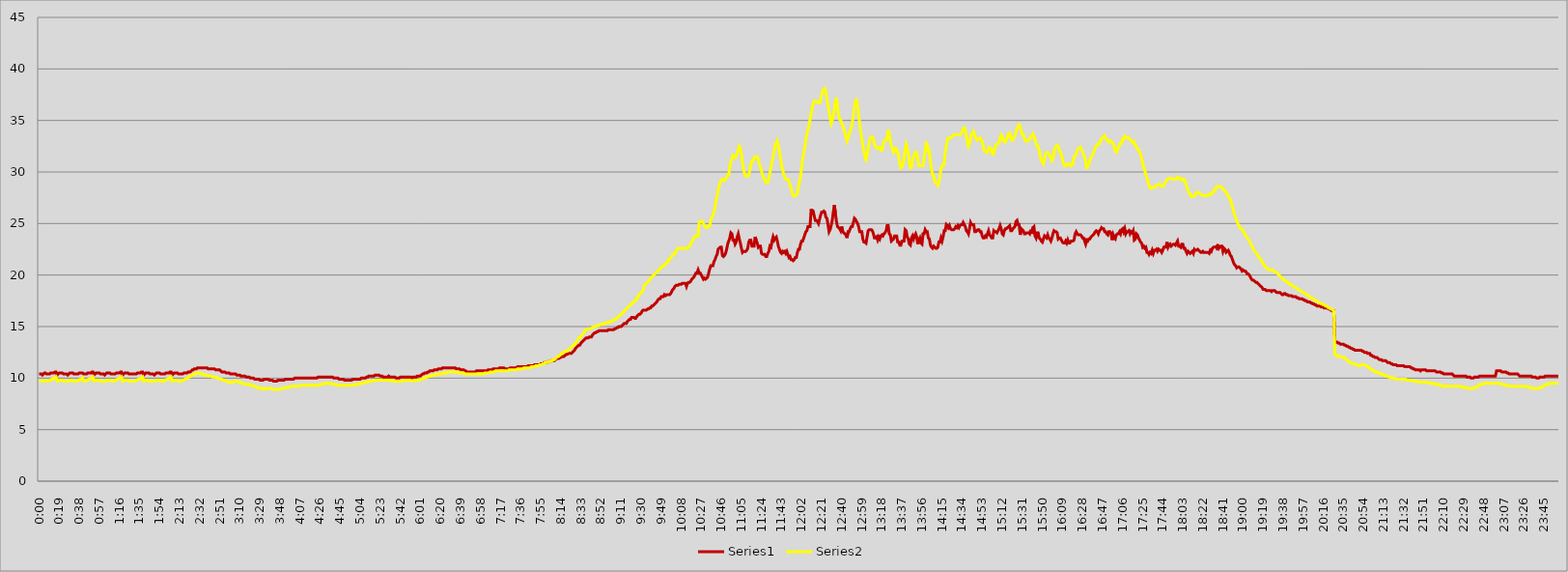
| Category | Series 0 | Series 1 |
|---|---|---|
| 0.0 | 10.4 | 9.7 |
| 0.0006944444444444445 | 10.4 | 9.7 |
| 0.00138888888888889 | 10.4 | 9.7 |
| 0.00208333333333333 | 10.3 | 9.7 |
| 0.00277777777777778 | 10.4 | 9.7 |
| 0.00347222222222222 | 10.5 | 9.8 |
| 0.00416666666666667 | 10.5 | 9.8 |
| 0.00486111111111111 | 10.4 | 9.7 |
| 0.00555555555555556 | 10.4 | 9.7 |
| 0.00625 | 10.4 | 9.7 |
| 0.00694444444444444 | 10.4 | 9.8 |
| 0.00763888888888889 | 10.5 | 9.8 |
| 0.00833333333333333 | 10.5 | 9.9 |
| 0.00902777777777778 | 10.5 | 9.9 |
| 0.00972222222222222 | 10.5 | 10 |
| 0.0104166666666667 | 10.6 | 10 |
| 0.0111111111111111 | 10.6 | 10.1 |
| 0.0118055555555556 | 10.3 | 9.7 |
| 0.0125 | 10.4 | 9.7 |
| 0.0131944444444444 | 10.5 | 9.8 |
| 0.0138888888888889 | 10.5 | 9.8 |
| 0.0145833333333333 | 10.5 | 9.8 |
| 0.0152777777777778 | 10.5 | 9.8 |
| 0.0159722222222222 | 10.4 | 9.7 |
| 0.0166666666666667 | 10.4 | 9.7 |
| 0.0173611111111111 | 10.4 | 9.7 |
| 0.0180555555555556 | 10.4 | 9.7 |
| 0.01875 | 10.3 | 9.7 |
| 0.0194444444444444 | 10.4 | 9.7 |
| 0.0201388888888889 | 10.5 | 9.8 |
| 0.0208333333333333 | 10.5 | 9.8 |
| 0.0215277777777778 | 10.5 | 9.8 |
| 0.0222222222222222 | 10.5 | 9.8 |
| 0.0229166666666667 | 10.4 | 9.7 |
| 0.0236111111111111 | 10.4 | 9.7 |
| 0.0243055555555556 | 10.4 | 9.7 |
| 0.025 | 10.4 | 9.7 |
| 0.0256944444444444 | 10.4 | 9.8 |
| 0.0263888888888889 | 10.5 | 9.8 |
| 0.0270833333333333 | 10.5 | 9.9 |
| 0.0277777777777778 | 10.5 | 9.9 |
| 0.0284722222222222 | 10.5 | 10 |
| 0.0291666666666667 | 10.4 | 9.7 |
| 0.0298611111111111 | 10.4 | 9.7 |
| 0.0305555555555556 | 10.4 | 9.7 |
| 0.03125 | 10.4 | 9.8 |
| 0.0319444444444444 | 10.5 | 9.8 |
| 0.0326388888888889 | 10.5 | 9.9 |
| 0.0333333333333333 | 10.5 | 9.9 |
| 0.0340277777777778 | 10.5 | 10 |
| 0.0347222222222222 | 10.6 | 10 |
| 0.0354166666666667 | 10.6 | 10.1 |
| 0.0361111111111111 | 10.3 | 9.7 |
| 0.0368055555555556 | 10.4 | 9.7 |
| 0.0375 | 10.5 | 9.8 |
| 0.0381944444444444 | 10.5 | 9.8 |
| 0.0388888888888889 | 10.5 | 9.8 |
| 0.0395833333333333 | 10.5 | 9.8 |
| 0.0402777777777778 | 10.4 | 9.7 |
| 0.0409722222222222 | 10.4 | 9.7 |
| 0.0416666666666667 | 10.4 | 9.7 |
| 0.0423611111111111 | 10.4 | 9.7 |
| 0.0430555555555556 | 10.3 | 9.7 |
| 0.04375 | 10.4 | 9.7 |
| 0.0444444444444444 | 10.5 | 9.8 |
| 0.0451388888888889 | 10.5 | 9.8 |
| 0.0458333333333333 | 10.5 | 9.8 |
| 0.0465277777777778 | 10.5 | 9.8 |
| 0.0472222222222222 | 10.4 | 9.7 |
| 0.0479166666666667 | 10.4 | 9.7 |
| 0.0486111111111111 | 10.4 | 9.7 |
| 0.0493055555555556 | 10.4 | 9.7 |
| 0.05 | 10.4 | 9.8 |
| 0.0506944444444444 | 10.5 | 9.8 |
| 0.0513888888888889 | 10.5 | 9.9 |
| 0.0520833333333333 | 10.5 | 9.9 |
| 0.0527777777777778 | 10.5 | 10 |
| 0.0534722222222222 | 10.6 | 10 |
| 0.0541666666666667 | 10.6 | 10.1 |
| 0.0548611111111111 | 10.3 | 9.7 |
| 0.0555555555555556 | 10.4 | 9.7 |
| 0.05625 | 10.5 | 9.8 |
| 0.0569444444444444 | 10.5 | 9.8 |
| 0.0576388888888889 | 10.5 | 9.8 |
| 0.0583333333333333 | 10.5 | 9.8 |
| 0.0590277777777778 | 10.4 | 9.7 |
| 0.0597222222222222 | 10.4 | 9.7 |
| 0.0604166666666667 | 10.4 | 9.7 |
| 0.0611111111111111 | 10.4 | 9.7 |
| 0.0618055555555556 | 10.4 | 9.7 |
| 0.0625 | 10.4 | 9.7 |
| 0.0631944444444444 | 10.4 | 9.7 |
| 0.0638888888888889 | 10.4 | 9.8 |
| 0.0645833333333333 | 10.5 | 9.8 |
| 0.0652777777777778 | 10.5 | 9.9 |
| 0.0659722222222222 | 10.5 | 9.9 |
| 0.0666666666666667 | 10.5 | 10 |
| 0.0673611111111111 | 10.6 | 10 |
| 0.0680555555555556 | 10.6 | 10.1 |
| 0.06875 | 10.3 | 9.7 |
| 0.0694444444444444 | 10.4 | 9.7 |
| 0.0701388888888889 | 10.5 | 9.8 |
| 0.0708333333333333 | 10.5 | 9.8 |
| 0.0715277777777778 | 10.5 | 9.8 |
| 0.0722222222222222 | 10.5 | 9.8 |
| 0.0729166666666667 | 10.4 | 9.7 |
| 0.0736111111111111 | 10.4 | 9.7 |
| 0.0743055555555556 | 10.4 | 9.7 |
| 0.075 | 10.4 | 9.7 |
| 0.0756944444444445 | 10.3 | 9.7 |
| 0.0763888888888889 | 10.4 | 9.7 |
| 0.0770833333333333 | 10.5 | 9.8 |
| 0.0777777777777778 | 10.5 | 9.8 |
| 0.0784722222222222 | 10.5 | 9.8 |
| 0.0791666666666667 | 10.5 | 9.8 |
| 0.0798611111111111 | 10.4 | 9.7 |
| 0.0805555555555556 | 10.4 | 9.7 |
| 0.08125 | 10.4 | 9.7 |
| 0.0819444444444444 | 10.4 | 9.7 |
| 0.0826388888888889 | 10.4 | 9.8 |
| 0.0833333333333333 | 10.5 | 9.8 |
| 0.0840277777777778 | 10.5 | 9.9 |
| 0.0847222222222222 | 10.5 | 9.9 |
| 0.0854166666666667 | 10.5 | 10 |
| 0.0861111111111111 | 10.6 | 10 |
| 0.0868055555555556 | 10.6 | 10.1 |
| 0.0875 | 10.3 | 9.7 |
| 0.0881944444444445 | 10.4 | 9.7 |
| 0.0888888888888889 | 10.5 | 9.8 |
| 0.0895833333333333 | 10.5 | 9.8 |
| 0.0902777777777778 | 10.5 | 9.8 |
| 0.0909722222222222 | 10.5 | 9.8 |
| 0.0916666666666667 | 10.4 | 9.7 |
| 0.0923611111111111 | 10.4 | 9.7 |
| 0.0930555555555556 | 10.4 | 9.7 |
| 0.09375 | 10.4 | 9.7 |
| 0.0944444444444444 | 10.4 | 9.8 |
| 0.0951388888888889 | 10.5 | 9.8 |
| 0.0958333333333333 | 10.5 | 9.9 |
| 0.0965277777777778 | 10.5 | 9.9 |
| 0.0972222222222222 | 10.5 | 10 |
| 0.0979166666666667 | 10.6 | 10 |
| 0.0986111111111111 | 10.6 | 10.1 |
| 0.0993055555555556 | 10.6 | 10.2 |
| 0.1 | 10.7 | 10.2 |
| 0.100694444444444 | 10.8 | 10.3 |
| 0.101388888888889 | 10.8 | 10.4 |
| 0.102083333333333 | 10.9 | 10.4 |
| 0.102777777777778 | 10.9 | 10.4 |
| 0.103472222222222 | 10.9 | 10.5 |
| 0.104166666666667 | 11 | 10.5 |
| 0.104861111111111 | 11 | 10.5 |
| 0.105555555555556 | 11 | 10.5 |
| 0.10625 | 11 | 10.4 |
| 0.106944444444444 | 11 | 10.4 |
| 0.107638888888889 | 11 | 10.4 |
| 0.108333333333333 | 11 | 10.3 |
| 0.109027777777778 | 11 | 10.3 |
| 0.109722222222222 | 11 | 10.3 |
| 0.110416666666667 | 11 | 10.3 |
| 0.111111111111111 | 10.9 | 10.2 |
| 0.111805555555556 | 10.9 | 10.2 |
| 0.1125 | 10.9 | 10.2 |
| 0.113194444444444 | 10.9 | 10.2 |
| 0.113888888888889 | 10.9 | 10.1 |
| 0.114583333333333 | 10.9 | 10.1 |
| 0.115277777777778 | 10.9 | 10.1 |
| 0.115972222222222 | 10.8 | 10.1 |
| 0.116666666666667 | 10.8 | 10 |
| 0.117361111111111 | 10.8 | 10 |
| 0.118055555555556 | 10.8 | 10 |
| 0.11875 | 10.8 | 9.9 |
| 0.119444444444444 | 10.7 | 9.9 |
| 0.120138888888889 | 10.6 | 9.9 |
| 0.120833333333333 | 10.6 | 9.8 |
| 0.121527777777778 | 10.6 | 9.8 |
| 0.122222222222222 | 10.6 | 9.8 |
| 0.122916666666667 | 10.5 | 9.7 |
| 0.123611111111111 | 10.5 | 9.7 |
| 0.124305555555556 | 10.5 | 9.6 |
| 0.125 | 10.5 | 9.6 |
| 0.125694444444444 | 10.4 | 9.6 |
| 0.126388888888889 | 10.4 | 9.6 |
| 0.127083333333333 | 10.4 | 9.6 |
| 0.127777777777778 | 10.4 | 9.6 |
| 0.128472222222222 | 10.4 | 9.7 |
| 0.129166666666667 | 10.4 | 9.7 |
| 0.129861111111111 | 10.3 | 9.7 |
| 0.130555555555556 | 10.3 | 9.7 |
| 0.13125 | 10.3 | 9.6 |
| 0.131944444444444 | 10.3 | 9.6 |
| 0.132638888888889 | 10.2 | 9.6 |
| 0.133333333333333 | 10.2 | 9.5 |
| 0.134027777777778 | 10.2 | 9.5 |
| 0.134722222222222 | 10.2 | 9.4 |
| 0.135416666666667 | 10.2 | 9.4 |
| 0.136111111111111 | 10.1 | 9.4 |
| 0.136805555555556 | 10.1 | 9.4 |
| 0.1375 | 10.1 | 9.4 |
| 0.138194444444444 | 10.1 | 9.4 |
| 0.138888888888889 | 10 | 9.3 |
| 0.139583333333333 | 10 | 9.3 |
| 0.140277777777778 | 10 | 9.3 |
| 0.140972222222222 | 10 | 9.2 |
| 0.141666666666667 | 9.9 | 9.2 |
| 0.142361111111111 | 9.9 | 9.2 |
| 0.143055555555556 | 9.9 | 9.1 |
| 0.14375 | 9.9 | 9.1 |
| 0.144444444444444 | 9.9 | 9 |
| 0.145138888888889 | 9.8 | 9 |
| 0.145833333333333 | 9.8 | 9 |
| 0.146527777777778 | 9.8 | 9 |
| 0.147222222222222 | 9.8 | 9 |
| 0.147916666666667 | 9.9 | 8.9 |
| 0.148611111111111 | 9.9 | 9 |
| 0.149305555555556 | 9.9 | 9 |
| 0.15 | 9.9 | 9 |
| 0.150694444444444 | 9.9 | 9 |
| 0.151388888888889 | 9.8 | 9 |
| 0.152083333333333 | 9.8 | 9 |
| 0.152777777777778 | 9.8 | 9 |
| 0.153472222222222 | 9.8 | 8.9 |
| 0.154166666666667 | 9.7 | 8.9 |
| 0.154861111111111 | 9.7 | 8.9 |
| 0.155555555555556 | 9.7 | 8.9 |
| 0.15625 | 9.7 | 8.9 |
| 0.156944444444444 | 9.8 | 8.9 |
| 0.157638888888889 | 9.8 | 8.9 |
| 0.158333333333333 | 9.8 | 8.9 |
| 0.159027777777778 | 9.8 | 9 |
| 0.159722222222222 | 9.8 | 9 |
| 0.160416666666667 | 9.8 | 9 |
| 0.161111111111111 | 9.8 | 9 |
| 0.161805555555556 | 9.9 | 9.1 |
| 0.1625 | 9.9 | 9.1 |
| 0.163194444444444 | 9.9 | 9.1 |
| 0.163888888888889 | 9.9 | 9.1 |
| 0.164583333333333 | 9.9 | 9.1 |
| 0.165277777777778 | 9.9 | 9.2 |
| 0.165972222222222 | 9.9 | 9.2 |
| 0.166666666666667 | 9.9 | 9.2 |
| 0.167361111111111 | 9.9 | 9.2 |
| 0.168055555555556 | 10 | 9.2 |
| 0.16875 | 10 | 9.2 |
| 0.169444444444444 | 10 | 9.2 |
| 0.170138888888889 | 10 | 9.2 |
| 0.170833333333333 | 10 | 9.2 |
| 0.171527777777778 | 10 | 9.3 |
| 0.172222222222222 | 10 | 9.3 |
| 0.172916666666667 | 10 | 9.3 |
| 0.173611111111111 | 10 | 9.3 |
| 0.174305555555556 | 10 | 9.3 |
| 0.175 | 10 | 9.3 |
| 0.175694444444444 | 10 | 9.3 |
| 0.176388888888889 | 10 | 9.3 |
| 0.177083333333333 | 10 | 9.3 |
| 0.177777777777778 | 10 | 9.3 |
| 0.178472222222222 | 10 | 9.3 |
| 0.179166666666667 | 10 | 9.3 |
| 0.179861111111111 | 10 | 9.3 |
| 0.180555555555556 | 10 | 9.3 |
| 0.18125 | 10 | 9.3 |
| 0.181944444444444 | 10 | 9.3 |
| 0.182638888888889 | 10 | 9.3 |
| 0.183333333333333 | 10.1 | 9.3 |
| 0.184027777777778 | 10.1 | 9.3 |
| 0.184722222222222 | 10.1 | 9.4 |
| 0.185416666666667 | 10.1 | 9.4 |
| 0.186111111111111 | 10.1 | 9.4 |
| 0.186805555555556 | 10.1 | 9.4 |
| 0.1875 | 10.1 | 9.5 |
| 0.188194444444444 | 10.1 | 9.5 |
| 0.188888888888889 | 10.1 | 9.5 |
| 0.189583333333333 | 10.1 | 9.5 |
| 0.190277777777778 | 10.1 | 9.5 |
| 0.190972222222222 | 10.1 | 9.5 |
| 0.191666666666667 | 10.1 | 9.5 |
| 0.192361111111111 | 10.1 | 9.4 |
| 0.193055555555556 | 10.1 | 9.4 |
| 0.19375 | 10 | 9.4 |
| 0.194444444444444 | 10 | 9.4 |
| 0.195138888888889 | 10 | 9.4 |
| 0.195833333333333 | 10 | 9.3 |
| 0.196527777777778 | 10 | 9.3 |
| 0.197222222222222 | 9.9 | 9.3 |
| 0.197916666666667 | 9.9 | 9.3 |
| 0.198611111111111 | 9.9 | 9.3 |
| 0.199305555555556 | 9.9 | 9.3 |
| 0.2 | 9.9 | 9.3 |
| 0.200694444444444 | 9.8 | 9.3 |
| 0.201388888888889 | 9.8 | 9.3 |
| 0.202083333333333 | 9.8 | 9.3 |
| 0.202777777777778 | 9.8 | 9.3 |
| 0.203472222222222 | 9.8 | 9.3 |
| 0.204166666666667 | 9.8 | 9.3 |
| 0.204861111111111 | 9.8 | 9.3 |
| 0.205555555555556 | 9.8 | 9.3 |
| 0.20625 | 9.9 | 9.3 |
| 0.206944444444444 | 9.9 | 9.3 |
| 0.207638888888889 | 9.9 | 9.4 |
| 0.208333333333333 | 9.9 | 9.4 |
| 0.209027777777778 | 9.9 | 9.4 |
| 0.209722222222222 | 9.9 | 9.4 |
| 0.210416666666667 | 9.9 | 9.4 |
| 0.211111111111111 | 9.9 | 9.5 |
| 0.211805555555556 | 10 | 9.5 |
| 0.2125 | 10 | 9.5 |
| 0.213194444444444 | 10 | 9.5 |
| 0.213888888888889 | 10 | 9.6 |
| 0.214583333333333 | 10 | 9.6 |
| 0.215277777777778 | 10.1 | 9.6 |
| 0.215972222222222 | 10.1 | 9.6 |
| 0.216666666666667 | 10.2 | 9.7 |
| 0.217361111111111 | 10.2 | 9.7 |
| 0.218055555555556 | 10.2 | 9.7 |
| 0.21875 | 10.2 | 9.7 |
| 0.219444444444444 | 10.2 | 9.7 |
| 0.220138888888889 | 10.2 | 9.8 |
| 0.220833333333333 | 10.3 | 9.8 |
| 0.221527777777778 | 10.3 | 9.8 |
| 0.222222222222222 | 10.3 | 9.8 |
| 0.222916666666667 | 10.3 | 9.8 |
| 0.223611111111111 | 10.3 | 9.8 |
| 0.224305555555556 | 10.2 | 9.8 |
| 0.225 | 10.2 | 9.8 |
| 0.225694444444444 | 10.2 | 9.8 |
| 0.226388888888889 | 10.1 | 9.8 |
| 0.227083333333333 | 10.1 | 9.8 |
| 0.227777777777778 | 10.1 | 9.8 |
| 0.228472222222222 | 10.1 | 9.8 |
| 0.229166666666667 | 10.1 | 9.8 |
| 0.229861111111111 | 10.2 | 9.8 |
| 0.230555555555556 | 10.1 | 9.8 |
| 0.23125 | 10.1 | 9.7 |
| 0.231944444444444 | 10.1 | 9.7 |
| 0.232638888888889 | 10.1 | 9.7 |
| 0.233333333333333 | 10.1 | 9.7 |
| 0.234027777777778 | 10.1 | 9.7 |
| 0.234722222222222 | 10 | 9.7 |
| 0.235416666666667 | 10 | 9.7 |
| 0.236111111111111 | 10 | 9.7 |
| 0.236805555555556 | 10 | 9.7 |
| 0.2375 | 10.1 | 9.7 |
| 0.238194444444444 | 10.1 | 9.7 |
| 0.238888888888889 | 10.1 | 9.7 |
| 0.239583333333333 | 10.1 | 9.7 |
| 0.240277777777778 | 10.1 | 9.8 |
| 0.240972222222222 | 10.1 | 9.8 |
| 0.241666666666667 | 10.1 | 9.8 |
| 0.242361111111111 | 10.1 | 9.8 |
| 0.243055555555556 | 10.1 | 9.8 |
| 0.24375 | 10.1 | 9.8 |
| 0.244444444444444 | 10.1 | 9.8 |
| 0.245138888888889 | 10 | 9.7 |
| 0.245833333333333 | 10.1 | 9.7 |
| 0.246527777777778 | 10.1 | 9.8 |
| 0.247222222222222 | 10.1 | 9.8 |
| 0.247916666666667 | 10.1 | 9.8 |
| 0.248611111111111 | 10.2 | 9.8 |
| 0.249305555555556 | 10.2 | 9.8 |
| 0.25 | 10.2 | 9.8 |
| 0.250694444444444 | 10.2 | 9.9 |
| 0.251388888888889 | 10.3 | 9.9 |
| 0.252083333333333 | 10.4 | 9.9 |
| 0.252777777777778 | 10.4 | 10 |
| 0.253472222222222 | 10.5 | 10 |
| 0.254166666666667 | 10.5 | 10.1 |
| 0.254861111111111 | 10.5 | 10.1 |
| 0.255555555555556 | 10.6 | 10.1 |
| 0.25625 | 10.6 | 10.2 |
| 0.256944444444444 | 10.7 | 10.2 |
| 0.257638888888889 | 10.7 | 10.2 |
| 0.258333333333333 | 10.7 | 10.3 |
| 0.259027777777778 | 10.7 | 10.3 |
| 0.259722222222222 | 10.8 | 10.3 |
| 0.260416666666667 | 10.8 | 10.3 |
| 0.261111111111111 | 10.8 | 10.4 |
| 0.261805555555556 | 10.8 | 10.4 |
| 0.2625 | 10.9 | 10.4 |
| 0.263194444444444 | 10.9 | 10.4 |
| 0.263888888888889 | 10.9 | 10.4 |
| 0.264583333333333 | 10.9 | 10.4 |
| 0.265277777777778 | 11 | 10.5 |
| 0.265972222222222 | 11 | 10.5 |
| 0.266666666666667 | 11 | 10.5 |
| 0.267361111111111 | 11 | 10.5 |
| 0.268055555555556 | 11 | 10.5 |
| 0.26875 | 11 | 10.6 |
| 0.269444444444444 | 11 | 10.6 |
| 0.270138888888889 | 11 | 10.6 |
| 0.270833333333333 | 11 | 10.6 |
| 0.271527777777778 | 11 | 10.6 |
| 0.272222222222222 | 11 | 10.6 |
| 0.272916666666667 | 11 | 10.6 |
| 0.273611111111111 | 11 | 10.6 |
| 0.274305555555556 | 10.9 | 10.6 |
| 0.275 | 10.9 | 10.6 |
| 0.275694444444444 | 10.9 | 10.6 |
| 0.276388888888889 | 10.9 | 10.5 |
| 0.277083333333333 | 10.8 | 10.5 |
| 0.277777777777778 | 10.8 | 10.5 |
| 0.278472222222222 | 10.8 | 10.5 |
| 0.279166666666667 | 10.8 | 10.5 |
| 0.279861111111111 | 10.7 | 10.4 |
| 0.280555555555556 | 10.7 | 10.4 |
| 0.28125 | 10.6 | 10.4 |
| 0.281944444444444 | 10.6 | 10.4 |
| 0.282638888888889 | 10.6 | 10.4 |
| 0.283333333333333 | 10.6 | 10.4 |
| 0.284027777777778 | 10.6 | 10.4 |
| 0.284722222222222 | 10.6 | 10.4 |
| 0.285416666666667 | 10.6 | 10.4 |
| 0.286111111111111 | 10.6 | 10.4 |
| 0.286805555555556 | 10.6 | 10.4 |
| 0.2875 | 10.7 | 10.4 |
| 0.288194444444444 | 10.7 | 10.4 |
| 0.288888888888889 | 10.7 | 10.4 |
| 0.289583333333333 | 10.7 | 10.4 |
| 0.290277777777778 | 10.7 | 10.4 |
| 0.290972222222222 | 10.7 | 10.4 |
| 0.291666666666667 | 10.7 | 10.4 |
| 0.292361111111111 | 10.7 | 10.4 |
| 0.293055555555556 | 10.7 | 10.5 |
| 0.29375 | 10.7 | 10.5 |
| 0.294444444444444 | 10.7 | 10.5 |
| 0.295138888888889 | 10.8 | 10.5 |
| 0.295833333333333 | 10.8 | 10.5 |
| 0.296527777777778 | 10.8 | 10.6 |
| 0.297222222222222 | 10.8 | 10.6 |
| 0.297916666666667 | 10.8 | 10.6 |
| 0.298611111111111 | 10.9 | 10.6 |
| 0.299305555555556 | 10.9 | 10.6 |
| 0.3 | 10.9 | 10.7 |
| 0.300694444444444 | 10.9 | 10.7 |
| 0.301388888888889 | 10.9 | 10.7 |
| 0.302083333333333 | 10.9 | 10.7 |
| 0.302777777777778 | 11 | 10.7 |
| 0.303472222222222 | 11 | 10.7 |
| 0.304166666666667 | 11 | 10.7 |
| 0.304861111111111 | 11 | 10.7 |
| 0.305555555555556 | 11 | 10.7 |
| 0.30625 | 10.9 | 10.7 |
| 0.306944444444444 | 10.9 | 10.7 |
| 0.307638888888889 | 10.9 | 10.7 |
| 0.308333333333333 | 10.9 | 10.7 |
| 0.309027777777778 | 10.9 | 10.8 |
| 0.309722222222222 | 11 | 10.8 |
| 0.310416666666667 | 11 | 10.8 |
| 0.311111111111111 | 11 | 10.8 |
| 0.311805555555556 | 11 | 10.8 |
| 0.3125 | 11 | 10.8 |
| 0.313194444444444 | 11 | 10.8 |
| 0.313888888888889 | 11 | 10.8 |
| 0.314583333333333 | 11.1 | 10.9 |
| 0.315277777777778 | 11.1 | 10.9 |
| 0.315972222222222 | 11.1 | 10.9 |
| 0.316666666666667 | 11.1 | 10.9 |
| 0.317361111111111 | 11.1 | 10.9 |
| 0.318055555555556 | 11.1 | 10.9 |
| 0.31875 | 11.1 | 11 |
| 0.319444444444444 | 11.1 | 11 |
| 0.320138888888889 | 11.1 | 11 |
| 0.320833333333333 | 11.1 | 11 |
| 0.321527777777778 | 11.2 | 11 |
| 0.322222222222222 | 11.2 | 11 |
| 0.322916666666667 | 11.2 | 11 |
| 0.323611111111111 | 11.2 | 11.1 |
| 0.324305555555556 | 11.2 | 11.1 |
| 0.325 | 11.2 | 11.1 |
| 0.325694444444444 | 11.3 | 11.1 |
| 0.326388888888889 | 11.3 | 11.2 |
| 0.327083333333333 | 11.3 | 11.2 |
| 0.327777777777778 | 11.3 | 11.2 |
| 0.328472222222222 | 11.3 | 11.2 |
| 0.329166666666667 | 11.3 | 11.3 |
| 0.329861111111111 | 11.4 | 11.3 |
| 0.330555555555556 | 11.4 | 11.3 |
| 0.33125 | 11.4 | 11.4 |
| 0.331944444444444 | 11.5 | 11.4 |
| 0.332638888888889 | 11.5 | 11.5 |
| 0.333333333333333 | 11.5 | 11.5 |
| 0.334027777777778 | 11.5 | 11.5 |
| 0.334722222222222 | 11.6 | 11.6 |
| 0.335416666666667 | 11.6 | 11.6 |
| 0.336111111111111 | 11.6 | 11.6 |
| 0.336805555555556 | 11.7 | 11.7 |
| 0.3375 | 11.7 | 11.7 |
| 0.338194444444444 | 11.7 | 11.8 |
| 0.338888888888889 | 11.7 | 11.8 |
| 0.339583333333333 | 11.8 | 11.9 |
| 0.340277777777778 | 11.9 | 12 |
| 0.340972222222222 | 11.9 | 12.1 |
| 0.341666666666667 | 11.9 | 12.1 |
| 0.342361111111111 | 12 | 12.2 |
| 0.343055555555556 | 12 | 12.3 |
| 0.34375 | 12.1 | 12.4 |
| 0.344444444444444 | 12.1 | 12.5 |
| 0.345138888888889 | 12.1 | 12.5 |
| 0.345833333333333 | 12.2 | 12.6 |
| 0.346527777777778 | 12.3 | 12.6 |
| 0.347222222222222 | 12.3 | 12.6 |
| 0.347916666666667 | 12.4 | 12.7 |
| 0.348611111111111 | 12.4 | 12.8 |
| 0.349305555555556 | 12.4 | 12.9 |
| 0.35 | 12.4 | 13 |
| 0.350694444444444 | 12.5 | 13.1 |
| 0.351388888888889 | 12.6 | 13.2 |
| 0.352083333333333 | 12.7 | 13.2 |
| 0.352777777777778 | 12.9 | 13.4 |
| 0.353472222222222 | 13 | 13.6 |
| 0.354166666666667 | 13.1 | 13.7 |
| 0.354861111111111 | 13.2 | 13.9 |
| 0.355555555555556 | 13.2 | 13.9 |
| 0.35625 | 13.4 | 14 |
| 0.356944444444444 | 13.5 | 14.2 |
| 0.357638888888889 | 13.6 | 14.3 |
| 0.358333333333333 | 13.7 | 14.4 |
| 0.359027777777778 | 13.8 | 14.6 |
| 0.359722222222222 | 13.9 | 14.7 |
| 0.360416666666667 | 13.9 | 14.7 |
| 0.361111111111111 | 13.9 | 14.8 |
| 0.361805555555556 | 14 | 14.8 |
| 0.3625 | 14 | 14.8 |
| 0.363194444444444 | 14 | 14.8 |
| 0.363888888888889 | 14.2 | 14.9 |
| 0.364583333333333 | 14.3 | 15 |
| 0.365277777777778 | 14.4 | 15 |
| 0.365972222222222 | 14.4 | 15 |
| 0.366666666666667 | 14.5 | 15.1 |
| 0.367361111111111 | 14.5 | 15.1 |
| 0.368055555555556 | 14.6 | 15.1 |
| 0.36875 | 14.6 | 15.2 |
| 0.369444444444444 | 14.6 | 15.2 |
| 0.370138888888889 | 14.6 | 15.2 |
| 0.370833333333333 | 14.6 | 15.2 |
| 0.371527777777778 | 14.6 | 15.3 |
| 0.372222222222222 | 14.6 | 15.3 |
| 0.372916666666667 | 14.6 | 15.4 |
| 0.373611111111111 | 14.6 | 15.4 |
| 0.374305555555556 | 14.7 | 15.4 |
| 0.375 | 14.7 | 15.4 |
| 0.375694444444444 | 14.7 | 15.5 |
| 0.376388888888889 | 14.7 | 15.5 |
| 0.377083333333333 | 14.7 | 15.6 |
| 0.377777777777778 | 14.7 | 15.6 |
| 0.378472222222222 | 14.8 | 15.7 |
| 0.379166666666667 | 14.8 | 15.7 |
| 0.379861111111111 | 14.9 | 15.8 |
| 0.380555555555556 | 14.9 | 15.9 |
| 0.38125 | 15 | 16 |
| 0.381944444444444 | 15 | 16.1 |
| 0.382638888888889 | 15 | 16.2 |
| 0.383333333333333 | 15.1 | 16.3 |
| 0.384027777777778 | 15.2 | 16.4 |
| 0.384722222222222 | 15.3 | 16.5 |
| 0.385416666666667 | 15.3 | 16.6 |
| 0.386111111111111 | 15.3 | 16.7 |
| 0.386805555555556 | 15.5 | 16.8 |
| 0.3875 | 15.6 | 16.9 |
| 0.388194444444444 | 15.7 | 17 |
| 0.388888888888889 | 15.7 | 17.1 |
| 0.389583333333333 | 15.9 | 17.2 |
| 0.390277777777778 | 15.9 | 17.3 |
| 0.390972222222222 | 15.9 | 17.4 |
| 0.391666666666667 | 15.8 | 17.5 |
| 0.392361111111111 | 15.8 | 17.5 |
| 0.393055555555556 | 16 | 17.8 |
| 0.39375 | 16.1 | 17.8 |
| 0.394444444444444 | 16.2 | 18.1 |
| 0.395138888888889 | 16.2 | 18.2 |
| 0.395833333333333 | 16.3 | 18.3 |
| 0.396527777777778 | 16.5 | 18.4 |
| 0.397222222222222 | 16.6 | 18.5 |
| 0.397916666666667 | 16.6 | 19 |
| 0.398611111111111 | 16.6 | 19.1 |
| 0.399305555555556 | 16.6 | 19.2 |
| 0.4 | 16.7 | 19.3 |
| 0.400694444444444 | 16.7 | 19.4 |
| 0.401388888888889 | 16.8 | 19.5 |
| 0.402083333333333 | 16.8 | 19.7 |
| 0.402777777777778 | 17 | 19.8 |
| 0.403472222222222 | 17 | 19.9 |
| 0.404166666666667 | 17.1 | 20 |
| 0.404861111111111 | 17.2 | 20.1 |
| 0.405555555555556 | 17.3 | 20.2 |
| 0.40625 | 17.4 | 20.3 |
| 0.406944444444444 | 17.6 | 20.4 |
| 0.407638888888889 | 17.7 | 20.5 |
| 0.408333333333333 | 17.7 | 20.6 |
| 0.409027777777778 | 17.9 | 20.8 |
| 0.409722222222222 | 17.9 | 20.8 |
| 0.410416666666667 | 17.9 | 20.9 |
| 0.411111111111111 | 18.1 | 20.9 |
| 0.411805555555556 | 18 | 21.1 |
| 0.4125 | 18.1 | 21.2 |
| 0.413194444444444 | 18.1 | 21.2 |
| 0.413888888888889 | 18.1 | 21.5 |
| 0.414583333333333 | 18.1 | 21.5 |
| 0.415277777777778 | 18.2 | 21.7 |
| 0.415972222222222 | 18.4 | 21.8 |
| 0.416666666666667 | 18.6 | 22 |
| 0.417361111111111 | 18.7 | 22 |
| 0.418055555555556 | 18.9 | 22.1 |
| 0.41875 | 19 | 22.3 |
| 0.419444444444444 | 19 | 22.5 |
| 0.420138888888889 | 19 | 22.6 |
| 0.420833333333333 | 19.1 | 22.6 |
| 0.421527777777778 | 19.1 | 22.6 |
| 0.422222222222222 | 19.1 | 22.6 |
| 0.422916666666667 | 19.2 | 22.6 |
| 0.423611111111111 | 19.2 | 22.6 |
| 0.424305555555556 | 19.2 | 22.6 |
| 0.425 | 19.2 | 22.6 |
| 0.425694444444444 | 18.9 | 22.6 |
| 0.426388888888889 | 19.2 | 22.6 |
| 0.427083333333333 | 19.3 | 22.8 |
| 0.427777777777778 | 19.3 | 22.8 |
| 0.428472222222222 | 19.4 | 23 |
| 0.429166666666667 | 19.6 | 23.2 |
| 0.429861111111111 | 19.7 | 23.4 |
| 0.430555555555556 | 19.8 | 23.6 |
| 0.43125 | 20 | 23.8 |
| 0.431944444444444 | 20.2 | 23.8 |
| 0.432638888888889 | 20.2 | 23.8 |
| 0.433333333333333 | 20.5 | 23.8 |
| 0.434027777777778 | 20.2 | 25.1 |
| 0.434722222222222 | 20.2 | 25.2 |
| 0.435416666666667 | 20 | 25.2 |
| 0.436111111111111 | 19.8 | 25.2 |
| 0.436805555555556 | 19.6 | 25 |
| 0.4375 | 19.7 | 24.8 |
| 0.438194444444444 | 19.6 | 24.6 |
| 0.438888888888889 | 19.7 | 24.6 |
| 0.439583333333333 | 19.8 | 24.6 |
| 0.440277777777778 | 20.2 | 24.8 |
| 0.440972222222222 | 20.6 | 24.8 |
| 0.441666666666667 | 20.9 | 25.3 |
| 0.442361111111111 | 20.9 | 25.6 |
| 0.443055555555556 | 20.9 | 25.8 |
| 0.44375 | 21.3 | 26.1 |
| 0.444444444444444 | 21.5 | 26.6 |
| 0.445138888888889 | 21.8 | 27.2 |
| 0.445833333333333 | 22 | 27.7 |
| 0.446527777777778 | 22.5 | 28.2 |
| 0.447222222222222 | 22.6 | 28.7 |
| 0.447916666666667 | 22.7 | 29 |
| 0.448611111111111 | 22.7 | 29.2 |
| 0.449305555555556 | 21.9 | 29.3 |
| 0.45 | 21.8 | 29.2 |
| 0.450694444444444 | 21.9 | 29.2 |
| 0.451388888888889 | 22.1 | 29.3 |
| 0.452083333333333 | 22.5 | 29.5 |
| 0.452777777777778 | 23 | 29.7 |
| 0.453472222222222 | 23.3 | 29.7 |
| 0.454166666666667 | 23.6 | 30.5 |
| 0.454861111111111 | 24.1 | 31 |
| 0.455555555555556 | 24 | 31.3 |
| 0.45625 | 23.4 | 31.6 |
| 0.456944444444444 | 23.4 | 31.5 |
| 0.457638888888889 | 23 | 31.4 |
| 0.458333333333333 | 23.2 | 31.5 |
| 0.459027777777778 | 23.7 | 31.8 |
| 0.459722222222222 | 24 | 32.2 |
| 0.460416666666667 | 23.5 | 32.5 |
| 0.461111111111111 | 23.1 | 32.3 |
| 0.461805555555556 | 22.6 | 31.7 |
| 0.4625 | 22.2 | 31 |
| 0.463194444444444 | 22.3 | 30.3 |
| 0.463888888888889 | 22.3 | 29.8 |
| 0.464583333333333 | 22.3 | 29.6 |
| 0.465277777777778 | 22.4 | 29.6 |
| 0.465972222222222 | 22.6 | 29.6 |
| 0.466666666666667 | 23.2 | 29.7 |
| 0.467361111111111 | 23.4 | 30.2 |
| 0.468055555555556 | 23.4 | 30.7 |
| 0.46875 | 22.8 | 31.1 |
| 0.469444444444444 | 22.8 | 31.1 |
| 0.470138888888889 | 22.8 | 31.4 |
| 0.470833333333333 | 23.7 | 31.4 |
| 0.471527777777778 | 23.4 | 31.5 |
| 0.472222222222222 | 23.1 | 31.5 |
| 0.472916666666667 | 22.7 | 31.2 |
| 0.473611111111111 | 22.8 | 30.8 |
| 0.474305555555556 | 22.8 | 30.5 |
| 0.475 | 22.1 | 30.1 |
| 0.475694444444444 | 22 | 29.7 |
| 0.476388888888889 | 22 | 29.4 |
| 0.477083333333333 | 22 | 29.3 |
| 0.477777777777778 | 21.8 | 29 |
| 0.478472222222222 | 21.8 | 29 |
| 0.479166666666667 | 22.1 | 29 |
| 0.479861111111111 | 22.3 | 29.4 |
| 0.480555555555556 | 22.8 | 29.9 |
| 0.48125 | 22.7 | 30.5 |
| 0.481944444444444 | 23.3 | 31 |
| 0.482638888888889 | 23.7 | 31.4 |
| 0.483333333333333 | 23.4 | 32 |
| 0.484027777777778 | 23.6 | 32.7 |
| 0.484722222222222 | 23.7 | 32.7 |
| 0.485416666666667 | 23.3 | 33 |
| 0.486111111111111 | 22.8 | 32.6 |
| 0.486805555555556 | 22.5 | 32 |
| 0.4875 | 22.2 | 31.4 |
| 0.488194444444444 | 22.1 | 30.7 |
| 0.488888888888889 | 22.3 | 30.2 |
| 0.489583333333333 | 22.2 | 29.8 |
| 0.490277777777778 | 22.3 | 29.5 |
| 0.490972222222222 | 22.1 | 29.3 |
| 0.491666666666667 | 22.3 | 29.3 |
| 0.492361111111111 | 22 | 29.3 |
| 0.493055555555556 | 21.7 | 29.1 |
| 0.49375 | 21.8 | 28.8 |
| 0.494444444444444 | 21.5 | 28.4 |
| 0.495138888888889 | 21.5 | 28 |
| 0.495833333333333 | 21.4 | 27.7 |
| 0.496527777777778 | 21.5 | 27.7 |
| 0.497222222222222 | 21.7 | 27.7 |
| 0.497916666666667 | 21.7 | 27.8 |
| 0.498611111111111 | 22.2 | 27.9 |
| 0.499305555555556 | 22.5 | 28.5 |
| 0.5 | 22.5 | 29 |
| 0.500694444444444 | 23 | 29.6 |
| 0.501388888888889 | 23.3 | 30.4 |
| 0.502083333333333 | 23.3 | 31.2 |
| 0.502777777777778 | 23.6 | 31.8 |
| 0.503472222222222 | 23.9 | 32.4 |
| 0.504166666666667 | 24.2 | 33.1 |
| 0.504861111111111 | 24.3 | 33.7 |
| 0.505555555555556 | 24.7 | 34.1 |
| 0.50625 | 24.7 | 34.5 |
| 0.506944444444444 | 24.7 | 35.1 |
| 0.507638888888889 | 26.3 | 35.7 |
| 0.508333333333333 | 26.3 | 36.2 |
| 0.509027777777778 | 26.2 | 36.6 |
| 0.509722222222222 | 25.7 | 36.9 |
| 0.510416666666667 | 25.3 | 36.9 |
| 0.511111111111111 | 25.3 | 36.8 |
| 0.511805555555556 | 25.2 | 36.8 |
| 0.5125 | 25 | 36.7 |
| 0.513194444444445 | 25.4 | 36.7 |
| 0.513888888888889 | 25.8 | 37 |
| 0.514583333333333 | 26.1 | 37.5 |
| 0.515277777777778 | 26.1 | 37.9 |
| 0.515972222222222 | 26.2 | 38 |
| 0.516666666666667 | 26.1 | 38.1 |
| 0.517361111111111 | 25.6 | 37.8 |
| 0.518055555555556 | 25.5 | 37.1 |
| 0.51875 | 24.9 | 36.5 |
| 0.519444444444444 | 24.2 | 35.9 |
| 0.520138888888889 | 24.4 | 35.2 |
| 0.520833333333333 | 24.8 | 34.7 |
| 0.521527777777778 | 25.3 | 35 |
| 0.522222222222222 | 26.1 | 35.4 |
| 0.522916666666667 | 26.8 | 36.1 |
| 0.523611111111111 | 26 | 36.8 |
| 0.524305555555556 | 25.2 | 37.2 |
| 0.525 | 24.7 | 36.1 |
| 0.525694444444444 | 24.6 | 35.6 |
| 0.526388888888889 | 24.5 | 35.1 |
| 0.527083333333333 | 24.3 | 35.1 |
| 0.527777777777778 | 24.7 | 34.7 |
| 0.528472222222222 | 24.2 | 34.5 |
| 0.529166666666667 | 24.1 | 34.2 |
| 0.529861111111111 | 24 | 33.8 |
| 0.530555555555556 | 23.9 | 33.4 |
| 0.53125 | 23.6 | 33 |
| 0.531944444444444 | 24.2 | 33.3 |
| 0.532638888888889 | 24.2 | 33.8 |
| 0.533333333333333 | 24.5 | 33.9 |
| 0.534027777777778 | 24.7 | 34.3 |
| 0.534722222222222 | 24.7 | 34.8 |
| 0.535416666666667 | 25.1 | 35.5 |
| 0.536111111111111 | 25.5 | 36.3 |
| 0.536805555555556 | 25.4 | 36.9 |
| 0.5375 | 25.2 | 37 |
| 0.538194444444444 | 25 | 36.4 |
| 0.538888888888889 | 24.7 | 35.6 |
| 0.539583333333333 | 24.2 | 34.7 |
| 0.540277777777778 | 24.2 | 33.9 |
| 0.540972222222222 | 24.2 | 33.2 |
| 0.541666666666667 | 23.5 | 32.6 |
| 0.542361111111111 | 23.2 | 32 |
| 0.543055555555556 | 23.2 | 31.5 |
| 0.54375 | 23.1 | 31.2 |
| 0.544444444444445 | 23.7 | 31.5 |
| 0.545138888888889 | 24.3 | 32.3 |
| 0.545833333333333 | 24.4 | 32.9 |
| 0.546527777777778 | 24.4 | 33.3 |
| 0.547222222222222 | 24.4 | 33.4 |
| 0.547916666666667 | 24.3 | 33.4 |
| 0.548611111111111 | 24 | 33.2 |
| 0.549305555555556 | 23.6 | 32.7 |
| 0.55 | 23.6 | 32.5 |
| 0.550694444444444 | 23.7 | 32.3 |
| 0.551388888888889 | 23.4 | 32.3 |
| 0.552083333333333 | 23.7 | 32.4 |
| 0.552777777777778 | 23.5 | 32.4 |
| 0.553472222222222 | 23.8 | 32.1 |
| 0.554166666666667 | 23.9 | 32.1 |
| 0.554861111111111 | 23.8 | 32.5 |
| 0.555555555555556 | 24 | 33 |
| 0.55625 | 24.1 | 33.1 |
| 0.556944444444444 | 24.3 | 33.1 |
| 0.557638888888889 | 24.8 | 33.1 |
| 0.558333333333333 | 24.8 | 34.1 |
| 0.559027777777778 | 24 | 33.8 |
| 0.559722222222222 | 23.9 | 33 |
| 0.560416666666667 | 23.3 | 32.5 |
| 0.561111111111111 | 23.4 | 32.3 |
| 0.561805555555556 | 23.5 | 31.9 |
| 0.5625 | 23.8 | 32 |
| 0.563194444444444 | 23.8 | 32.3 |
| 0.563888888888889 | 23.8 | 32.2 |
| 0.564583333333333 | 23.2 | 31.9 |
| 0.565277777777778 | 23.2 | 31.5 |
| 0.565972222222222 | 22.9 | 30.8 |
| 0.566666666666667 | 22.9 | 30.4 |
| 0.567361111111111 | 23.3 | 30.5 |
| 0.568055555555556 | 23.3 | 30.8 |
| 0.56875 | 23.3 | 31.3 |
| 0.569444444444444 | 24.4 | 32.2 |
| 0.570138888888889 | 24.3 | 32.7 |
| 0.570833333333333 | 23.7 | 32.4 |
| 0.571527777777778 | 23.5 | 31.8 |
| 0.572222222222222 | 23 | 31 |
| 0.572916666666667 | 22.9 | 30.4 |
| 0.573611111111111 | 23.6 | 30.4 |
| 0.574305555555556 | 23.8 | 31.2 |
| 0.575 | 23.5 | 31.4 |
| 0.575694444444445 | 23.8 | 31.8 |
| 0.576388888888889 | 24 | 31.9 |
| 0.577083333333333 | 23.7 | 31.9 |
| 0.577777777777778 | 23 | 31.2 |
| 0.578472222222222 | 23.4 | 30.6 |
| 0.579166666666667 | 23.6 | 30.6 |
| 0.579861111111111 | 23.1 | 30.6 |
| 0.580555555555556 | 23 | 30.6 |
| 0.58125 | 24 | 30.6 |
| 0.581944444444444 | 24 | 31.3 |
| 0.582638888888889 | 24.4 | 32.1 |
| 0.583333333333333 | 24.2 | 32.8 |
| 0.584027777777778 | 24.2 | 32.7 |
| 0.584722222222222 | 23.6 | 32 |
| 0.585416666666667 | 23.5 | 32 |
| 0.586111111111111 | 22.9 | 30.9 |
| 0.586805555555556 | 22.7 | 30.3 |
| 0.5875 | 22.6 | 29.7 |
| 0.588194444444444 | 22.8 | 29.7 |
| 0.588888888888889 | 22.7 | 29.1 |
| 0.589583333333333 | 22.6 | 28.9 |
| 0.590277777777778 | 22.6 | 28.9 |
| 0.590972222222222 | 22.7 | 28.7 |
| 0.591666666666667 | 23.2 | 29 |
| 0.592361111111111 | 23.2 | 29.6 |
| 0.593055555555556 | 23.6 | 30.3 |
| 0.59375 | 23.3 | 30.6 |
| 0.594444444444444 | 23.7 | 30.7 |
| 0.595138888888889 | 24.3 | 30.7 |
| 0.595833333333333 | 24.3 | 32 |
| 0.596527777777778 | 24.9 | 32.5 |
| 0.597222222222222 | 24.8 | 33.1 |
| 0.597916666666667 | 24.6 | 33.3 |
| 0.598611111111111 | 24.8 | 33.3 |
| 0.599305555555556 | 24.5 | 33.3 |
| 0.6 | 24.4 | 33.4 |
| 0.600694444444444 | 24.4 | 33.5 |
| 0.601388888888889 | 24.4 | 33.6 |
| 0.602083333333333 | 24.5 | 33.6 |
| 0.602777777777778 | 24.7 | 33.6 |
| 0.603472222222222 | 24.6 | 33.6 |
| 0.604166666666667 | 24.8 | 33.6 |
| 0.604861111111111 | 24.6 | 33.6 |
| 0.605555555555556 | 24.8 | 33.6 |
| 0.60625 | 24.9 | 33.7 |
| 0.606944444444445 | 24.9 | 33.9 |
| 0.607638888888889 | 25.1 | 34.2 |
| 0.608333333333333 | 24.9 | 34.3 |
| 0.609027777777778 | 24.7 | 34.1 |
| 0.609722222222222 | 24.3 | 33.5 |
| 0.610416666666667 | 24.2 | 32.9 |
| 0.611111111111111 | 24 | 32.5 |
| 0.611805555555556 | 24.5 | 32.8 |
| 0.6125 | 25.1 | 33.3 |
| 0.613194444444444 | 24.9 | 33.7 |
| 0.613888888888889 | 24.9 | 33.7 |
| 0.614583333333333 | 24.9 | 33.9 |
| 0.615277777777778 | 24.2 | 33.5 |
| 0.615972222222222 | 24.2 | 33.3 |
| 0.616666666666667 | 24.3 | 33.1 |
| 0.617361111111111 | 24.4 | 33.2 |
| 0.618055555555556 | 24.4 | 33.2 |
| 0.61875 | 24.2 | 33.3 |
| 0.619444444444444 | 24.2 | 33.1 |
| 0.620138888888889 | 23.8 | 33 |
| 0.620833333333333 | 23.6 | 32.5 |
| 0.621527777777778 | 23.6 | 32.1 |
| 0.622222222222222 | 23.8 | 32 |
| 0.622916666666667 | 23.7 | 31.9 |
| 0.623611111111111 | 24 | 31.9 |
| 0.624305555555556 | 24.3 | 32.3 |
| 0.625 | 23.9 | 32.4 |
| 0.625694444444444 | 23.8 | 32.2 |
| 0.626388888888889 | 23.6 | 32.2 |
| 0.627083333333333 | 23.6 | 31.6 |
| 0.627777777777778 | 24.3 | 31.9 |
| 0.628472222222222 | 24.2 | 32.3 |
| 0.629166666666667 | 24.2 | 32.6 |
| 0.629861111111111 | 24.1 | 32.7 |
| 0.630555555555556 | 24.3 | 32.8 |
| 0.63125 | 24.5 | 32.8 |
| 0.631944444444444 | 24.8 | 33.3 |
| 0.632638888888889 | 24.5 | 33.6 |
| 0.633333333333333 | 24 | 33.5 |
| 0.634027777777778 | 23.9 | 33.1 |
| 0.634722222222222 | 24.3 | 33 |
| 0.635416666666667 | 24.5 | 32.9 |
| 0.636111111111111 | 24.5 | 33.1 |
| 0.636805555555556 | 24.6 | 33.4 |
| 0.6375 | 24.7 | 33.7 |
| 0.638194444444445 | 24.8 | 33.8 |
| 0.638888888888889 | 24.3 | 33.4 |
| 0.639583333333333 | 24.3 | 33.1 |
| 0.640277777777778 | 24.5 | 33.1 |
| 0.640972222222222 | 24.6 | 33.3 |
| 0.641666666666667 | 24.7 | 33.6 |
| 0.642361111111111 | 25.2 | 33.8 |
| 0.643055555555556 | 25.3 | 34.3 |
| 0.64375 | 24.9 | 34.3 |
| 0.644444444444444 | 24.9 | 34.7 |
| 0.645138888888889 | 23.9 | 34.3 |
| 0.645833333333333 | 24.5 | 34 |
| 0.646527777777778 | 24.4 | 33.6 |
| 0.647222222222222 | 24.3 | 33.6 |
| 0.647916666666667 | 24 | 33.3 |
| 0.648611111111111 | 24 | 33 |
| 0.649305555555556 | 24.1 | 33 |
| 0.65 | 24.1 | 33 |
| 0.650694444444444 | 24.1 | 33.1 |
| 0.651388888888889 | 24 | 33.2 |
| 0.652083333333333 | 24.4 | 33.4 |
| 0.652777777777778 | 24 | 33.5 |
| 0.653472222222222 | 24.6 | 33.7 |
| 0.654166666666667 | 24.7 | 33.5 |
| 0.654861111111111 | 23.8 | 33.2 |
| 0.655555555555556 | 23.6 | 32.7 |
| 0.65625 | 24.1 | 32.5 |
| 0.656944444444444 | 24.1 | 32.5 |
| 0.657638888888889 | 23.6 | 32.1 |
| 0.658333333333333 | 23.5 | 31.5 |
| 0.659027777777778 | 23.3 | 31.1 |
| 0.659722222222222 | 23.2 | 31 |
| 0.660416666666667 | 23.5 | 30.8 |
| 0.661111111111111 | 23.8 | 31.3 |
| 0.661805555555556 | 23.7 | 31.8 |
| 0.6625 | 23.6 | 31.9 |
| 0.663194444444444 | 23.9 | 31.9 |
| 0.663888888888889 | 23.6 | 31.8 |
| 0.664583333333333 | 23.5 | 31.6 |
| 0.665277777777778 | 23.3 | 31.4 |
| 0.665972222222222 | 23.6 | 31.1 |
| 0.666666666666667 | 24 | 31.3 |
| 0.667361111111111 | 24.3 | 31.8 |
| 0.668055555555556 | 24.2 | 32.4 |
| 0.66875 | 24.2 | 32.5 |
| 0.669444444444445 | 24.1 | 32.6 |
| 0.670138888888889 | 23.5 | 32.5 |
| 0.670833333333333 | 23.6 | 32 |
| 0.671527777777778 | 23.6 | 32 |
| 0.672222222222222 | 23.4 | 31.7 |
| 0.672916666666667 | 23.2 | 31.2 |
| 0.673611111111111 | 23.1 | 30.8 |
| 0.674305555555556 | 23.1 | 30.6 |
| 0.675 | 23.3 | 30.6 |
| 0.675694444444444 | 23.1 | 30.7 |
| 0.676388888888889 | 23.4 | 30.7 |
| 0.677083333333333 | 23.1 | 30.8 |
| 0.677777777777778 | 23.1 | 30.7 |
| 0.678472222222222 | 23.3 | 30.6 |
| 0.679166666666667 | 23.3 | 30.8 |
| 0.679861111111111 | 23.3 | 30.8 |
| 0.680555555555556 | 23.4 | 31.5 |
| 0.68125 | 24 | 31.5 |
| 0.681944444444444 | 24.2 | 31.8 |
| 0.682638888888889 | 24 | 32.1 |
| 0.683333333333333 | 23.9 | 32.3 |
| 0.684027777777778 | 23.9 | 32.3 |
| 0.684722222222222 | 23.9 | 32.4 |
| 0.685416666666667 | 23.8 | 32.2 |
| 0.686111111111111 | 23.6 | 32 |
| 0.686805555555556 | 23.6 | 31.7 |
| 0.6875 | 23.3 | 31.5 |
| 0.688194444444444 | 23 | 31 |
| 0.688888888888889 | 23.4 | 30.3 |
| 0.689583333333333 | 23.3 | 30.6 |
| 0.690277777777778 | 23.5 | 30.8 |
| 0.690972222222222 | 23.5 | 31.1 |
| 0.691666666666667 | 23.7 | 31.4 |
| 0.692361111111111 | 23.8 | 31.6 |
| 0.693055555555556 | 23.9 | 31.8 |
| 0.69375 | 24 | 32 |
| 0.694444444444444 | 24.2 | 32.3 |
| 0.695138888888889 | 24.3 | 32.6 |
| 0.695833333333333 | 24.2 | 32.7 |
| 0.696527777777778 | 24 | 32.7 |
| 0.697222222222222 | 24.3 | 32.7 |
| 0.697916666666667 | 24.4 | 33 |
| 0.698611111111111 | 24.6 | 33.2 |
| 0.699305555555556 | 24.5 | 33.4 |
| 0.7 | 24.5 | 33.4 |
| 0.700694444444445 | 24.2 | 33.5 |
| 0.701388888888889 | 24.2 | 33.3 |
| 0.702083333333333 | 24 | 33.1 |
| 0.702777777777778 | 23.9 | 33.1 |
| 0.703472222222222 | 24.2 | 32.9 |
| 0.704166666666667 | 24.2 | 33 |
| 0.704861111111111 | 24.1 | 33 |
| 0.705555555555556 | 23.4 | 32.9 |
| 0.70625 | 23.9 | 32.7 |
| 0.706944444444444 | 23.6 | 32.5 |
| 0.707638888888889 | 23.5 | 32 |
| 0.708333333333333 | 23.9 | 31.9 |
| 0.709027777777778 | 24 | 32.1 |
| 0.709722222222222 | 24 | 32.4 |
| 0.710416666666667 | 24.2 | 32.6 |
| 0.711111111111111 | 24 | 32.8 |
| 0.711805555555556 | 24.4 | 32.8 |
| 0.7125 | 24.5 | 33.2 |
| 0.713194444444444 | 24.2 | 33.2 |
| 0.713888888888889 | 24.5 | 33.5 |
| 0.714583333333333 | 24 | 33.4 |
| 0.715277777777778 | 24.2 | 33.3 |
| 0.715972222222222 | 24.2 | 33.3 |
| 0.716666666666667 | 24.3 | 33.3 |
| 0.717361111111111 | 24 | 33.2 |
| 0.718055555555556 | 24.2 | 33 |
| 0.71875 | 24.1 | 33 |
| 0.719444444444444 | 24.3 | 32.8 |
| 0.720138888888889 | 23.4 | 32.9 |
| 0.720833333333333 | 23.5 | 32.7 |
| 0.721527777777778 | 24 | 32.4 |
| 0.722222222222222 | 23.9 | 32.2 |
| 0.722916666666667 | 23.6 | 32.2 |
| 0.723611111111111 | 23.4 | 32 |
| 0.724305555555556 | 23.2 | 31.7 |
| 0.725 | 23.1 | 31.3 |
| 0.725694444444444 | 22.7 | 30.9 |
| 0.726388888888889 | 22.8 | 30.4 |
| 0.727083333333333 | 22.6 | 30.1 |
| 0.727777777777778 | 22.7 | 29.8 |
| 0.728472222222222 | 22.2 | 29.4 |
| 0.729166666666667 | 22.2 | 29.1 |
| 0.729861111111111 | 22 | 28.6 |
| 0.730555555555556 | 22.2 | 28.5 |
| 0.73125 | 22.1 | 28.4 |
| 0.731944444444445 | 22.4 | 28.5 |
| 0.732638888888889 | 22.1 | 28.5 |
| 0.733333333333333 | 22.4 | 28.5 |
| 0.734027777777778 | 22.4 | 28.6 |
| 0.734722222222222 | 22.5 | 28.7 |
| 0.735416666666667 | 22.3 | 28.7 |
| 0.736111111111111 | 22.5 | 28.8 |
| 0.736805555555556 | 22.4 | 28.8 |
| 0.7375 | 22.4 | 28.7 |
| 0.738194444444444 | 22.2 | 28.6 |
| 0.738888888888889 | 22.4 | 28.6 |
| 0.739583333333333 | 22.7 | 28.7 |
| 0.740277777777778 | 22.7 | 28.9 |
| 0.740972222222222 | 22.7 | 29.1 |
| 0.741666666666667 | 23.2 | 29.3 |
| 0.742361111111111 | 22.7 | 29.3 |
| 0.743055555555556 | 22.9 | 29.4 |
| 0.74375 | 23 | 29.4 |
| 0.744444444444444 | 22.8 | 29.4 |
| 0.745138888888889 | 22.9 | 29.3 |
| 0.745833333333333 | 23 | 29.3 |
| 0.746527777777778 | 23 | 29.3 |
| 0.747222222222222 | 22.9 | 29.3 |
| 0.747916666666667 | 23.1 | 29.3 |
| 0.748611111111111 | 23.3 | 29.5 |
| 0.749305555555556 | 22.8 | 29.4 |
| 0.75 | 22.8 | 29.4 |
| 0.750694444444444 | 22.7 | 29.4 |
| 0.751388888888889 | 23 | 29.2 |
| 0.752083333333333 | 23 | 29.2 |
| 0.752777777777778 | 22.6 | 29.3 |
| 0.753472222222222 | 22.6 | 29.1 |
| 0.754166666666667 | 22.3 | 28.8 |
| 0.754861111111111 | 22.1 | 28.5 |
| 0.755555555555556 | 22.3 | 28.2 |
| 0.75625 | 22.2 | 27.9 |
| 0.756944444444444 | 22.1 | 27.9 |
| 0.757638888888889 | 22.2 | 27.6 |
| 0.758333333333333 | 22.3 | 27.6 |
| 0.759027777777778 | 22.1 | 27.6 |
| 0.759722222222222 | 22.5 | 27.7 |
| 0.760416666666667 | 22.4 | 27.8 |
| 0.761111111111111 | 22.4 | 28 |
| 0.761805555555556 | 22.5 | 28 |
| 0.7625 | 22.4 | 28 |
| 0.763194444444445 | 22.3 | 27.9 |
| 0.763888888888889 | 22.2 | 27.8 |
| 0.764583333333333 | 22.2 | 27.8 |
| 0.765277777777778 | 22.3 | 27.7 |
| 0.765972222222222 | 22.2 | 27.7 |
| 0.766666666666667 | 22.2 | 27.7 |
| 0.767361111111111 | 22.2 | 27.7 |
| 0.768055555555556 | 22.2 | 27.7 |
| 0.76875 | 22.2 | 27.8 |
| 0.769444444444444 | 22.1 | 27.8 |
| 0.770138888888889 | 22.4 | 27.9 |
| 0.770833333333333 | 22.3 | 27.8 |
| 0.771527777777778 | 22.6 | 27.9 |
| 0.772222222222222 | 22.7 | 28.1 |
| 0.772916666666667 | 22.7 | 28.3 |
| 0.773611111111111 | 22.7 | 28.3 |
| 0.774305555555556 | 22.8 | 28.6 |
| 0.775 | 22.4 | 28.6 |
| 0.775694444444444 | 22.8 | 28.6 |
| 0.776388888888889 | 22.7 | 28.6 |
| 0.777083333333333 | 22.8 | 28.6 |
| 0.777777777777778 | 22.8 | 28.5 |
| 0.778472222222222 | 22.3 | 28.4 |
| 0.779166666666667 | 22.6 | 28.2 |
| 0.779861111111111 | 22.5 | 28.2 |
| 0.780555555555556 | 22.2 | 28 |
| 0.78125 | 22.3 | 27.8 |
| 0.781944444444444 | 22.4 | 27.7 |
| 0.782638888888889 | 22.2 | 27.5 |
| 0.783333333333333 | 21.9 | 27.3 |
| 0.784027777777778 | 21.8 | 27 |
| 0.784722222222222 | 21.5 | 26.6 |
| 0.785416666666667 | 21.2 | 26.2 |
| 0.786111111111111 | 21 | 25.9 |
| 0.786805555555556 | 20.9 | 25.6 |
| 0.7875 | 20.7 | 25.3 |
| 0.788194444444444 | 20.8 | 25 |
| 0.788888888888889 | 20.8 | 24.8 |
| 0.789583333333333 | 20.7 | 24.6 |
| 0.790277777777778 | 20.6 | 24.5 |
| 0.790972222222222 | 20.4 | 24.4 |
| 0.791666666666667 | 20.5 | 24.4 |
| 0.792361111111111 | 20.4 | 24.1 |
| 0.793055555555556 | 20.4 | 23.9 |
| 0.79375 | 20.3 | 23.8 |
| 0.794444444444445 | 20.1 | 23.6 |
| 0.795138888888889 | 20.1 | 23.5 |
| 0.795833333333333 | 20 | 23.3 |
| 0.796527777777778 | 19.8 | 23.1 |
| 0.797222222222222 | 19.6 | 22.9 |
| 0.797916666666667 | 19.5 | 22.7 |
| 0.798611111111111 | 19.5 | 22.5 |
| 0.799305555555556 | 19.4 | 22.3 |
| 0.8 | 19.3 | 22.2 |
| 0.800694444444444 | 19.3 | 22.1 |
| 0.801388888888889 | 19.2 | 21.9 |
| 0.802083333333333 | 19.1 | 21.8 |
| 0.802777777777778 | 19 | 21.6 |
| 0.803472222222222 | 18.9 | 21.5 |
| 0.804166666666667 | 18.8 | 21.3 |
| 0.804861111111111 | 18.6 | 21.1 |
| 0.805555555555556 | 18.6 | 21 |
| 0.80625 | 18.6 | 20.8 |
| 0.806944444444444 | 18.5 | 20.7 |
| 0.807638888888889 | 18.5 | 20.6 |
| 0.808333333333333 | 18.5 | 20.6 |
| 0.809027777777778 | 18.5 | 20.5 |
| 0.809722222222222 | 18.5 | 20.5 |
| 0.810416666666667 | 18.4 | 20.5 |
| 0.811111111111111 | 18.5 | 20.5 |
| 0.811805555555556 | 18.5 | 20.4 |
| 0.8125 | 18.5 | 20.3 |
| 0.813194444444444 | 18.4 | 20.3 |
| 0.813888888888889 | 18.3 | 20.2 |
| 0.814583333333333 | 18.3 | 20.1 |
| 0.815277777777778 | 18.3 | 20 |
| 0.815972222222222 | 18.3 | 19.9 |
| 0.816666666666667 | 18.2 | 19.8 |
| 0.817361111111111 | 18.1 | 19.7 |
| 0.818055555555556 | 18.1 | 19.6 |
| 0.81875 | 18.2 | 19.5 |
| 0.819444444444445 | 18.2 | 19.4 |
| 0.820138888888889 | 18.1 | 19.4 |
| 0.820833333333333 | 18.1 | 19.3 |
| 0.821527777777778 | 18 | 19.3 |
| 0.822222222222222 | 18 | 19.1 |
| 0.822916666666667 | 18 | 19.1 |
| 0.823611111111111 | 18 | 19 |
| 0.824305555555556 | 17.9 | 19 |
| 0.825 | 17.9 | 18.9 |
| 0.825694444444445 | 17.9 | 18.8 |
| 0.826388888888889 | 17.9 | 18.8 |
| 0.827083333333333 | 17.8 | 18.7 |
| 0.827777777777778 | 17.8 | 18.6 |
| 0.828472222222222 | 17.7 | 18.6 |
| 0.829166666666667 | 17.7 | 18.5 |
| 0.829861111111111 | 17.7 | 18.4 |
| 0.830555555555556 | 17.7 | 18.4 |
| 0.83125 | 17.6 | 18.3 |
| 0.831944444444444 | 17.6 | 18.2 |
| 0.832638888888889 | 17.5 | 18.2 |
| 0.833333333333333 | 17.5 | 18.1 |
| 0.834027777777778 | 17.4 | 18.1 |
| 0.834722222222222 | 17.4 | 18 |
| 0.835416666666667 | 17.4 | 17.9 |
| 0.836111111111111 | 17.3 | 17.8 |
| 0.836805555555556 | 17.3 | 17.8 |
| 0.8375 | 17.2 | 17.7 |
| 0.838194444444444 | 17.2 | 17.6 |
| 0.838888888888889 | 17.1 | 17.6 |
| 0.839583333333333 | 17.1 | 17.5 |
| 0.840277777777778 | 17 | 17.5 |
| 0.840972222222222 | 17 | 17.4 |
| 0.841666666666667 | 17 | 17.3 |
| 0.842361111111111 | 17 | 17.3 |
| 0.843055555555556 | 16.9 | 17.2 |
| 0.84375 | 16.9 | 17.2 |
| 0.844444444444444 | 16.9 | 17.1 |
| 0.845138888888889 | 16.8 | 17.1 |
| 0.845833333333333 | 16.8 | 17 |
| 0.846527777777778 | 16.8 | 17 |
| 0.847222222222222 | 16.8 | 16.9 |
| 0.847916666666667 | 16.7 | 16.8 |
| 0.848611111111111 | 16.7 | 16.8 |
| 0.849305555555556 | 16.6 | 16.7 |
| 0.85 | 16.6 | 16.7 |
| 0.850694444444445 | 16.5 | 16.6 |
| 0.851388888888889 | 16.5 | 16.5 |
| 0.852083333333333 | 13.6 | 12.3 |
| 0.852777777777778 | 13.5 | 12.2 |
| 0.853472222222222 | 13.5 | 12.2 |
| 0.854166666666667 | 13.4 | 12.1 |
| 0.854861111111111 | 13.4 | 12.1 |
| 0.855555555555556 | 13.3 | 12.1 |
| 0.85625 | 13.3 | 12.1 |
| 0.856944444444445 | 13.3 | 12 |
| 0.857638888888889 | 13.3 | 12 |
| 0.858333333333333 | 13.2 | 12 |
| 0.859027777777778 | 13.2 | 11.9 |
| 0.859722222222222 | 13.1 | 11.8 |
| 0.860416666666667 | 13.1 | 11.7 |
| 0.861111111111111 | 13 | 11.6 |
| 0.861805555555556 | 13 | 11.6 |
| 0.8625 | 12.9 | 11.5 |
| 0.863194444444444 | 12.9 | 11.4 |
| 0.863888888888889 | 12.8 | 11.4 |
| 0.864583333333333 | 12.8 | 11.4 |
| 0.865277777777778 | 12.7 | 11.4 |
| 0.865972222222222 | 12.7 | 11.3 |
| 0.866666666666667 | 12.7 | 11.3 |
| 0.867361111111111 | 12.7 | 11.2 |
| 0.868055555555556 | 12.7 | 11.2 |
| 0.86875 | 12.7 | 11.2 |
| 0.869444444444444 | 12.7 | 11.3 |
| 0.870138888888889 | 12.6 | 11.3 |
| 0.870833333333333 | 12.6 | 11.3 |
| 0.871527777777778 | 12.5 | 11.3 |
| 0.872222222222222 | 12.5 | 11.2 |
| 0.872916666666667 | 12.5 | 11.2 |
| 0.873611111111111 | 12.4 | 11.1 |
| 0.874305555555556 | 12.4 | 11 |
| 0.875 | 12.4 | 11 |
| 0.875694444444444 | 12.2 | 10.9 |
| 0.876388888888889 | 12.2 | 10.8 |
| 0.877083333333333 | 12.1 | 10.8 |
| 0.877777777777778 | 12.1 | 10.7 |
| 0.878472222222222 | 12 | 10.6 |
| 0.879166666666667 | 12 | 10.6 |
| 0.879861111111111 | 12 | 10.6 |
| 0.880555555555556 | 11.9 | 10.5 |
| 0.88125 | 11.8 | 10.5 |
| 0.881944444444445 | 11.8 | 10.4 |
| 0.882638888888889 | 11.8 | 10.4 |
| 0.883333333333333 | 11.7 | 10.4 |
| 0.884027777777778 | 11.7 | 10.3 |
| 0.884722222222222 | 11.7 | 10.3 |
| 0.885416666666667 | 11.7 | 10.2 |
| 0.886111111111111 | 11.6 | 10.2 |
| 0.886805555555556 | 11.5 | 10.2 |
| 0.8875 | 11.5 | 10.1 |
| 0.888194444444445 | 11.5 | 10.1 |
| 0.888888888888889 | 11.4 | 10.1 |
| 0.889583333333333 | 11.4 | 10 |
| 0.890277777777778 | 11.3 | 10 |
| 0.890972222222222 | 11.3 | 10 |
| 0.891666666666667 | 11.3 | 10 |
| 0.892361111111111 | 11.3 | 9.9 |
| 0.893055555555556 | 11.2 | 9.9 |
| 0.89375 | 11.2 | 9.9 |
| 0.894444444444444 | 11.2 | 9.9 |
| 0.895138888888889 | 11.2 | 9.9 |
| 0.895833333333333 | 11.2 | 9.9 |
| 0.896527777777778 | 11.2 | 9.9 |
| 0.897222222222222 | 11.2 | 9.9 |
| 0.897916666666667 | 11.1 | 9.9 |
| 0.898611111111111 | 11.1 | 9.9 |
| 0.899305555555556 | 11.1 | 9.8 |
| 0.9 | 11.1 | 9.8 |
| 0.900694444444444 | 11.1 | 9.8 |
| 0.901388888888889 | 11.1 | 9.8 |
| 0.902083333333333 | 11 | 9.8 |
| 0.902777777777778 | 11 | 9.8 |
| 0.903472222222222 | 10.9 | 9.7 |
| 0.904166666666667 | 10.9 | 9.7 |
| 0.904861111111111 | 10.8 | 9.7 |
| 0.905555555555556 | 10.8 | 9.7 |
| 0.90625 | 10.8 | 9.7 |
| 0.906944444444444 | 10.8 | 9.6 |
| 0.907638888888889 | 10.8 | 9.6 |
| 0.908333333333333 | 10.7 | 9.6 |
| 0.909027777777778 | 10.8 | 9.6 |
| 0.909722222222222 | 10.8 | 9.6 |
| 0.910416666666667 | 10.8 | 9.6 |
| 0.911111111111111 | 10.8 | 9.6 |
| 0.911805555555556 | 10.8 | 9.6 |
| 0.9125 | 10.7 | 9.6 |
| 0.913194444444445 | 10.7 | 9.6 |
| 0.913888888888889 | 10.7 | 9.5 |
| 0.914583333333333 | 10.7 | 9.5 |
| 0.915277777777778 | 10.7 | 9.5 |
| 0.915972222222222 | 10.7 | 9.5 |
| 0.916666666666667 | 10.7 | 9.5 |
| 0.917361111111111 | 10.7 | 9.5 |
| 0.918055555555556 | 10.7 | 9.4 |
| 0.91875 | 10.6 | 9.4 |
| 0.919444444444445 | 10.6 | 9.4 |
| 0.920138888888889 | 10.6 | 9.4 |
| 0.920833333333333 | 10.6 | 9.3 |
| 0.921527777777778 | 10.6 | 9.3 |
| 0.922222222222222 | 10.5 | 9.3 |
| 0.922916666666667 | 10.5 | 9.2 |
| 0.923611111111111 | 10.4 | 9.2 |
| 0.924305555555556 | 10.4 | 9.2 |
| 0.925 | 10.4 | 9.2 |
| 0.925694444444444 | 10.4 | 9.2 |
| 0.926388888888889 | 10.4 | 9.2 |
| 0.927083333333333 | 10.4 | 9.2 |
| 0.927777777777778 | 10.4 | 9.2 |
| 0.928472222222222 | 10.4 | 9.2 |
| 0.929166666666667 | 10.4 | 9.2 |
| 0.929861111111111 | 10.3 | 9.2 |
| 0.930555555555556 | 10.2 | 9.2 |
| 0.93125 | 10.2 | 9.2 |
| 0.931944444444444 | 10.2 | 9.2 |
| 0.932638888888889 | 10.2 | 9.2 |
| 0.933333333333333 | 10.2 | 9.2 |
| 0.934027777777778 | 10.2 | 9.2 |
| 0.934722222222222 | 10.2 | 9.2 |
| 0.935416666666667 | 10.2 | 9.2 |
| 0.936111111111111 | 10.2 | 9.1 |
| 0.936805555555556 | 10.2 | 9.1 |
| 0.9375 | 10.2 | 9.1 |
| 0.938194444444444 | 10.2 | 9.1 |
| 0.938888888888889 | 10.1 | 9 |
| 0.939583333333333 | 10.1 | 9 |
| 0.940277777777778 | 10.1 | 9 |
| 0.940972222222222 | 10.1 | 9 |
| 0.941666666666667 | 10 | 9 |
| 0.942361111111111 | 10 | 9 |
| 0.943055555555556 | 10 | 9 |
| 0.94375 | 10.1 | 9.1 |
| 0.944444444444445 | 10.1 | 9.1 |
| 0.945138888888889 | 10.1 | 9.1 |
| 0.945833333333333 | 10.1 | 9.2 |
| 0.946527777777778 | 10.1 | 9.3 |
| 0.947222222222222 | 10.2 | 9.3 |
| 0.947916666666667 | 10.2 | 9.4 |
| 0.948611111111111 | 10.2 | 9.4 |
| 0.949305555555556 | 10.2 | 9.4 |
| 0.95 | 10.2 | 9.5 |
| 0.950694444444445 | 10.2 | 9.5 |
| 0.951388888888889 | 10.2 | 9.5 |
| 0.952083333333333 | 10.2 | 9.5 |
| 0.952777777777778 | 10.2 | 9.5 |
| 0.953472222222222 | 10.2 | 9.5 |
| 0.954166666666667 | 10.2 | 9.5 |
| 0.954861111111111 | 10.2 | 9.5 |
| 0.955555555555556 | 10.2 | 9.5 |
| 0.95625 | 10.2 | 9.5 |
| 0.956944444444444 | 10.2 | 9.5 |
| 0.957638888888889 | 10.2 | 9.5 |
| 0.958333333333333 | 10.7 | 9.5 |
| 0.959027777777778 | 10.7 | 9.5 |
| 0.959722222222222 | 10.7 | 9.5 |
| 0.960416666666667 | 10.7 | 9.5 |
| 0.961111111111111 | 10.7 | 9.4 |
| 0.961805555555556 | 10.6 | 9.4 |
| 0.9625 | 10.6 | 9.4 |
| 0.963194444444444 | 10.6 | 9.4 |
| 0.963888888888889 | 10.6 | 9.3 |
| 0.964583333333333 | 10.6 | 9.3 |
| 0.965277777777778 | 10.5 | 9.3 |
| 0.965972222222222 | 10.5 | 9.2 |
| 0.966666666666667 | 10.4 | 9.2 |
| 0.967361111111111 | 10.4 | 9.2 |
| 0.968055555555556 | 10.4 | 9.2 |
| 0.96875 | 10.4 | 9.2 |
| 0.969444444444444 | 10.4 | 9.2 |
| 0.970138888888889 | 10.4 | 9.2 |
| 0.970833333333333 | 10.4 | 9.2 |
| 0.971527777777778 | 10.4 | 9.2 |
| 0.972222222222222 | 10.4 | 9.2 |
| 0.972916666666667 | 10.3 | 9.2 |
| 0.973611111111111 | 10.2 | 9.2 |
| 0.974305555555556 | 10.2 | 9.2 |
| 0.975 | 10.2 | 9.2 |
| 0.975694444444445 | 10.2 | 9.2 |
| 0.976388888888889 | 10.2 | 9.2 |
| 0.977083333333333 | 10.2 | 9.2 |
| 0.977777777777778 | 10.2 | 9.2 |
| 0.978472222222222 | 10.2 | 9.2 |
| 0.979166666666667 | 10.2 | 9.1 |
| 0.979861111111111 | 10.2 | 9.1 |
| 0.980555555555556 | 10.2 | 9.1 |
| 0.98125 | 10.2 | 9.1 |
| 0.981944444444445 | 10.1 | 9 |
| 0.982638888888889 | 10.1 | 9 |
| 0.983333333333333 | 10.1 | 9 |
| 0.984027777777778 | 10.1 | 9 |
| 0.984722222222222 | 10 | 9 |
| 0.985416666666667 | 10 | 9 |
| 0.986111111111111 | 10 | 9 |
| 0.986805555555556 | 10.1 | 9.1 |
| 0.9875 | 10.1 | 9.1 |
| 0.988194444444444 | 10.1 | 9.1 |
| 0.988888888888889 | 10.1 | 9.2 |
| 0.989583333333333 | 10.1 | 9.3 |
| 0.990277777777778 | 10.2 | 9.3 |
| 0.990972222222222 | 10.2 | 9.4 |
| 0.991666666666667 | 10.2 | 9.4 |
| 0.992361111111111 | 10.2 | 9.4 |
| 0.993055555555556 | 10.2 | 9.5 |
| 0.99375 | 10.2 | 9.5 |
| 0.994444444444444 | 10.2 | 9.5 |
| 0.995138888888889 | 10.2 | 9.5 |
| 0.995833333333333 | 10.2 | 9.5 |
| 0.996527777777778 | 10.2 | 9.5 |
| 0.997222222222222 | 10.2 | 9.5 |
| 0.997916666666667 | 10.2 | 9.5 |
| 0.998611111111111 | 10.2 | 9.5 |
| 0.999305555555556 | 10.2 | 9.5 |